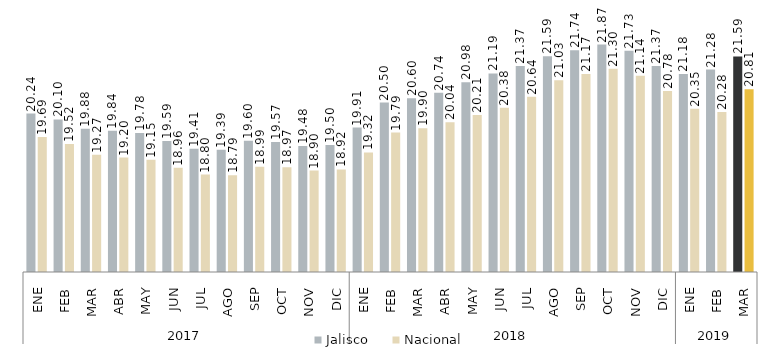
| Category | Jalisco | Nacional |
|---|---|---|
| 0 | 20.242 | 19.689 |
| 1 | 20.104 | 19.521 |
| 2 | 19.883 | 19.271 |
| 3 | 19.836 | 19.204 |
| 4 | 19.784 | 19.15 |
| 5 | 19.592 | 18.96 |
| 6 | 19.41 | 18.802 |
| 7 | 19.39 | 18.785 |
| 8 | 19.599 | 18.985 |
| 9 | 19.573 | 18.973 |
| 10 | 19.479 | 18.896 |
| 11 | 19.501 | 18.922 |
| 12 | 19.911 | 19.325 |
| 13 | 20.504 | 19.794 |
| 14 | 20.604 | 19.897 |
| 15 | 20.737 | 20.038 |
| 16 | 20.979 | 20.206 |
| 17 | 21.19 | 20.378 |
| 18 | 21.367 | 20.642 |
| 19 | 21.594 | 21.027 |
| 20 | 21.738 | 21.174 |
| 21 | 21.871 | 21.3 |
| 22 | 21.725 | 21.139 |
| 23 | 21.369 | 20.777 |
| 24 | 21.177 | 20.354 |
| 25 | 21.282 | 20.28 |
| 26 | 21.592 | 20.814 |